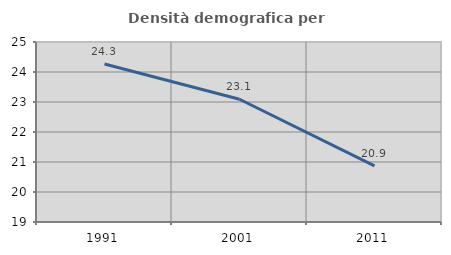
| Category | Densità demografica |
|---|---|
| 1991.0 | 24.267 |
| 2001.0 | 23.092 |
| 2011.0 | 20.869 |